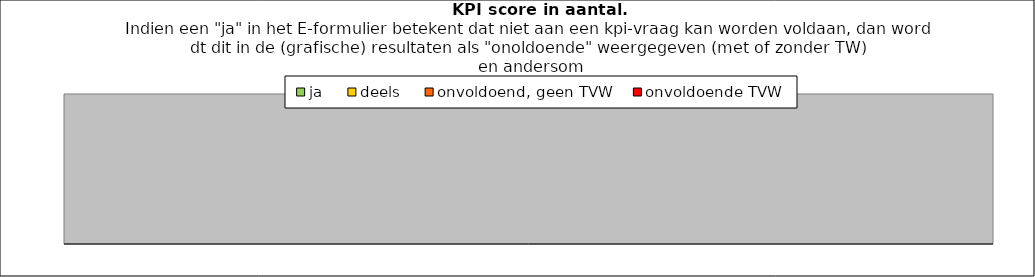
| Category | ja | deels | onvoldoend, geen TVW | onvoldoende TVW |
|---|---|---|---|---|
| 0 | 0 | 0 | 0 | 0 |